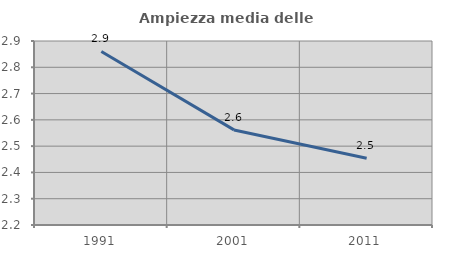
| Category | Ampiezza media delle famiglie |
|---|---|
| 1991.0 | 2.86 |
| 2001.0 | 2.562 |
| 2011.0 | 2.454 |